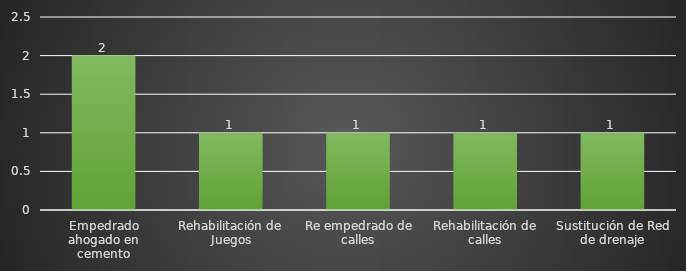
| Category | INDICADOR  |
|---|---|
| Empedrado ahogado en cemento | 2 |
| Rehabilitación de Juegos | 1 |
| Re empedrado de calles | 1 |
| Rehabilitación de calles | 1 |
| Sustitución de Red de drenaje | 1 |